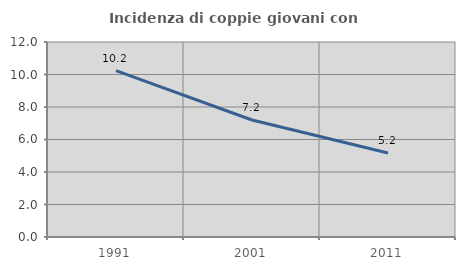
| Category | Incidenza di coppie giovani con figli |
|---|---|
| 1991.0 | 10.236 |
| 2001.0 | 7.2 |
| 2011.0 | 5.172 |